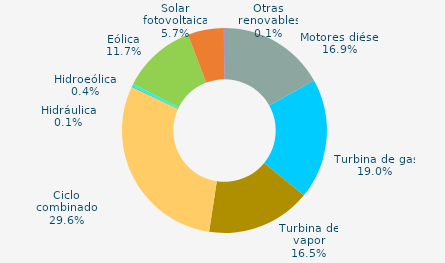
| Category | Series 0 |
|---|---|
| Motores diésel | 16.9 |
| Turbina de gas | 19 |
| Turbina de vapor | 16.5 |
| Ciclo combinado | 29.6 |
| Cogeneración | 0 |
| Hidráulica | 0.1 |
| Hidroeólica | 0.4 |
| Eólica | 11.7 |
| Solar fotovoltaica | 5.7 |
| Otras renovables | 0.1 |